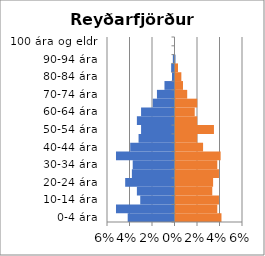
| Category | % karlar | %konur |
|---|---|---|
| 0-4 ára | -0.042 | 0.041 |
| 5-9 ára | -0.052 | 0.037 |
| 10-14 ára | -0.03 | 0.039 |
| 15-19 ára | -0.033 | 0.033 |
| 20-24 ára | -0.044 | 0.033 |
| 25-29 ára | -0.038 | 0.039 |
| 30-34 ára | -0.037 | 0.037 |
| 35-39 ára | -0.052 | 0.04 |
| 40-44 ára | -0.039 | 0.025 |
| 45-49 ára | -0.032 | 0.019 |
| 50-54 ára | -0.03 | 0.034 |
| 55-59 ára | -0.033 | 0.019 |
| 60-64 ára | -0.03 | 0.017 |
| 65-69 ára | -0.019 | 0.019 |
| 70-74 ára | -0.016 | 0.01 |
| 75-79 ára | -0.009 | 0.007 |
| 80-84 ára | -0.002 | 0.005 |
| 85-89 ára | -0.003 | 0.002 |
| 90-94 ára | -0.001 | 0 |
| 95-99 ára | 0 | 0 |
| 100 ára og eldri | 0 | 0 |